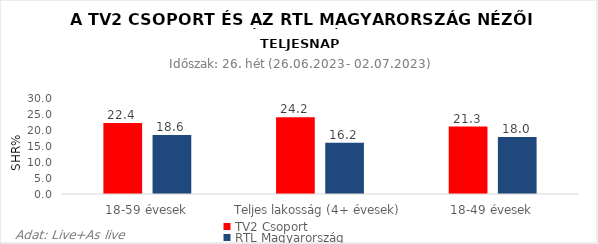
| Category | TV2 Csoport | RTL Magyarország |
|---|---|---|
| 18-59 évesek | 22.4 | 18.6 |
| Teljes lakosság (4+ évesek) | 24.2 | 16.2 |
| 18-49 évesek | 21.3 | 18 |